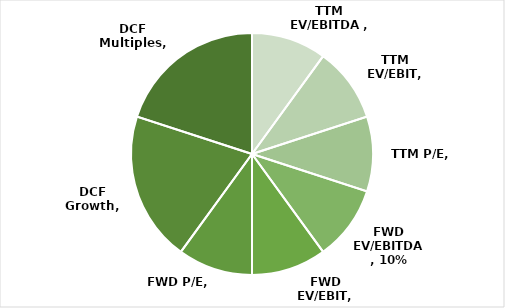
| Category | Series 0 |
|---|---|
| TTM EV/EBITDA  | 0.1 |
| TTM EV/EBIT | 0.1 |
| TTM P/E | 0.1 |
| FWD EV/EBITDA | 0.1 |
| FWD EV/EBIT | 0.1 |
| FWD P/E | 0.1 |
| DCF Growth | 0.2 |
| DCF Multiples | 0.2 |